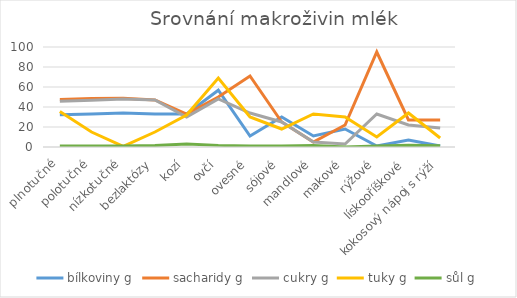
| Category | bílkoviny g | sacharidy g | cukry g | tuky g | sůl g |
|---|---|---|---|---|---|
| plnotučné | 32.2 | 47.5 | 45.86 | 35.4 | 1 |
| polotučné | 33 | 48.5 | 46.71 | 15 | 1 |
| nízkotučné | 34 | 48.8 | 48 | 0.6 | 1 |
| bezlaktózy | 33 | 47 | 47 | 15 | 1.5 |
| kozí | 33 | 33 | 30 | 32 | 3 |
| ovčí | 56.8 | 50 | 48 | 69 | 1.625 |
| ovesné | 11 | 71 | 34 | 30 | 1 |
| sójové | 30 | 25 | 25 | 18 | 0.9 |
| mandlové | 11 | 5 | 5 | 33 | 1.4 |
| makové | 18 | 22 | 3 | 30 | 0 |
| rýžové | 1 | 95 | 33 | 10 | 0.9 |
| lískooříškové | 7 | 27 | 22 | 34 | 1.7 |
| kokosový nápoj s rýží | 1 | 27 | 19 | 9 | 1.3 |